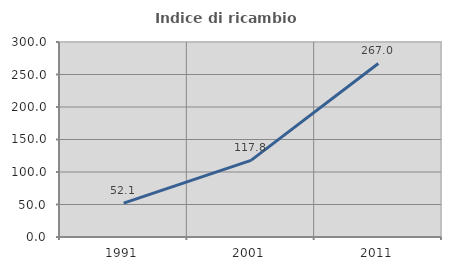
| Category | Indice di ricambio occupazionale  |
|---|---|
| 1991.0 | 52.093 |
| 2001.0 | 117.834 |
| 2011.0 | 267.01 |